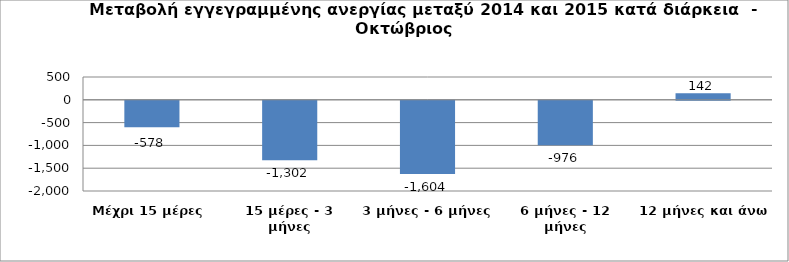
| Category | Series 0 |
|---|---|
| Μέχρι 15 μέρες | -578 |
| 15 μέρες - 3 μήνες | -1302 |
| 3 μήνες - 6 μήνες | -1604 |
| 6 μήνες - 12 μήνες | -976 |
| 12 μήνες και άνω | 142 |